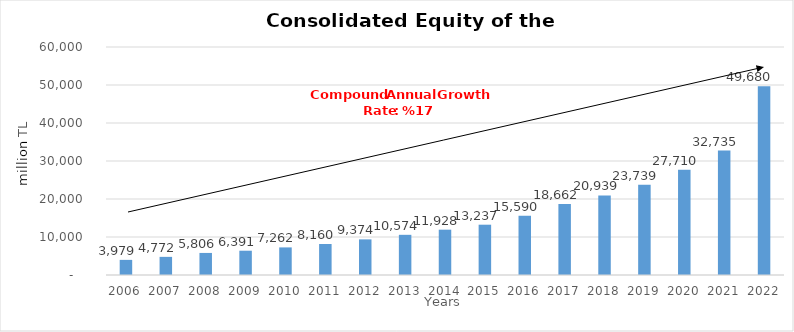
| Category | Total |
|---|---|
| 2006.0 | 3978.535 |
| 2007.0 | 4771.635 |
| 2008.0 | 5805.717 |
| 2009.0 | 6391.175 |
| 2010.0 | 7262.062 |
| 2011.0 | 8159.605 |
| 2012.0 | 9374.412 |
| 2013.0 | 10573.674 |
| 2014.0 | 11928 |
| 2015.0 | 13237 |
| 2016.0 | 15590 |
| 2017.0 | 18662 |
| 2018.0 | 20939 |
| 2019.0 | 23739 |
| 2020.0 | 27710 |
| 2021.0 | 32735 |
| 2022.0 | 49680 |